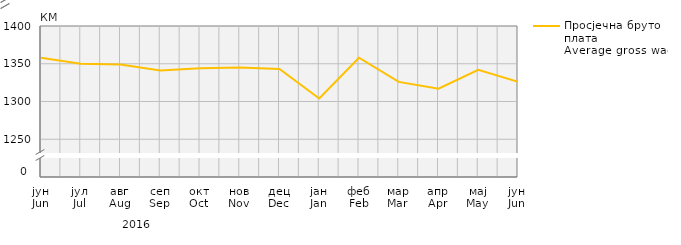
| Category | Просјечна бруто плата
Average gross wage |
|---|---|
| јун
Jun | 1358 |
| јул
Jul | 1350 |
| авг
Aug | 1349 |
| сеп
Sep | 1341 |
| окт
Oct | 1344 |
| нов
Nov | 1345 |
| дец
Dec | 1343 |
| јан
Jan | 1304 |
| феб
Feb | 1358 |
| мар
Mar | 1326 |
| апр
Apr | 1317 |
| мај
May | 1342 |
| јун
Jun | 1326 |